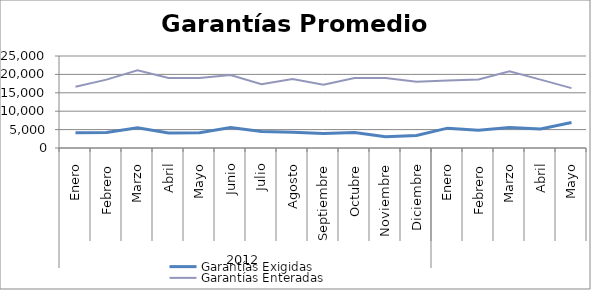
| Category | Garantías Exigidas | Garantías Enteradas |
|---|---|---|
| 0 | 4146.8 | 16662.483 |
| 1 | 4190.531 | 18572.749 |
| 2 | 5482.211 | 21128.648 |
| 3 | 4079.038 | 18997.51 |
| 4 | 4141.554 | 19005.364 |
| 5 | 5549.139 | 19818.91 |
| 6 | 4487.023 | 17351.39 |
| 7 | 4277.924 | 18719.955 |
| 8 | 3940.893 | 17217.403 |
| 9 | 4180.69 | 19046.939 |
| 10 | 3056.997 | 19028.425 |
| 11 | 3426.799 | 17994.819 |
| 12 | 5390.461 | 18317.043 |
| 13 | 4807.91 | 18608.477 |
| 14 | 5582.739 | 20850.446 |
| 15 | 5196.755 | 18583.166 |
| 16 | 6912.615 | 16266.455 |